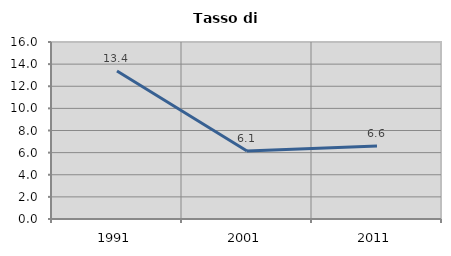
| Category | Tasso di disoccupazione   |
|---|---|
| 1991.0 | 13.38 |
| 2001.0 | 6.14 |
| 2011.0 | 6.604 |